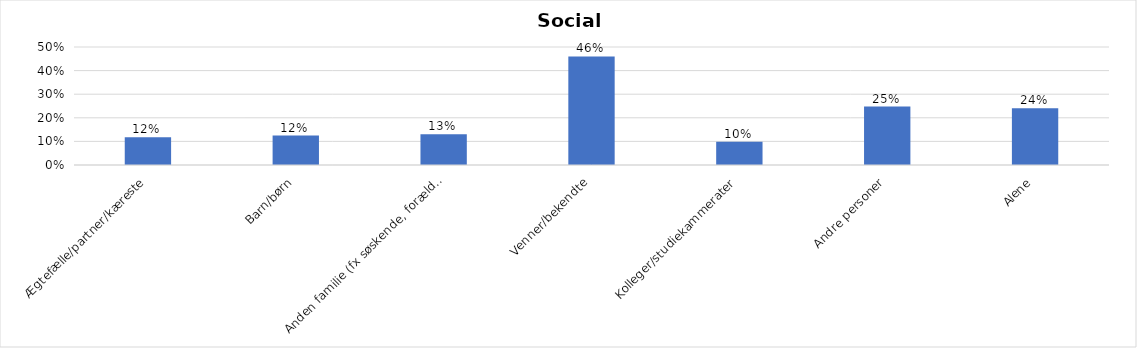
| Category | % |
|---|---|
| Ægtefælle/partner/kæreste | 0.118 |
| Barn/børn | 0.125 |
| Anden familie (fx søskende, forældre) | 0.13 |
| Venner/bekendte | 0.46 |
| Kolleger/studiekammerater | 0.099 |
| Andre personer | 0.248 |
| Alene | 0.241 |